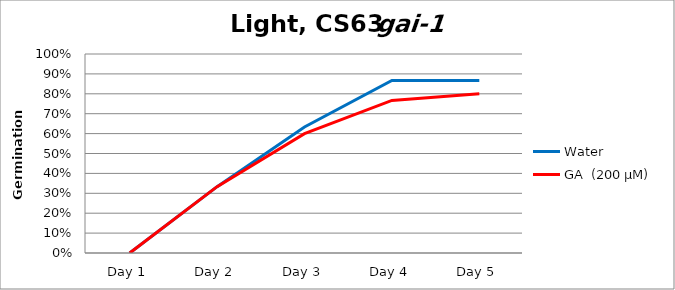
| Category | Water | GA  (200 µM)  |
|---|---|---|
| Day 1 | 0 | 0 |
| Day 2 | 0.333 | 0.333 |
| Day 3 | 0.633 | 0.6 |
| Day 4 | 0.867 | 0.767 |
| Day 5 | 0.867 | 0.8 |